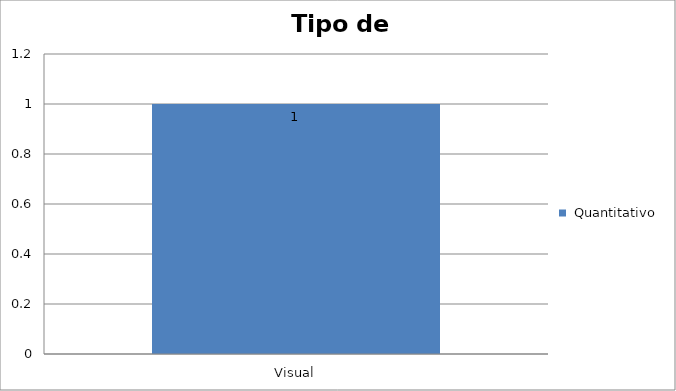
| Category |  Quantitativo |
|---|---|
| Visual | 1 |